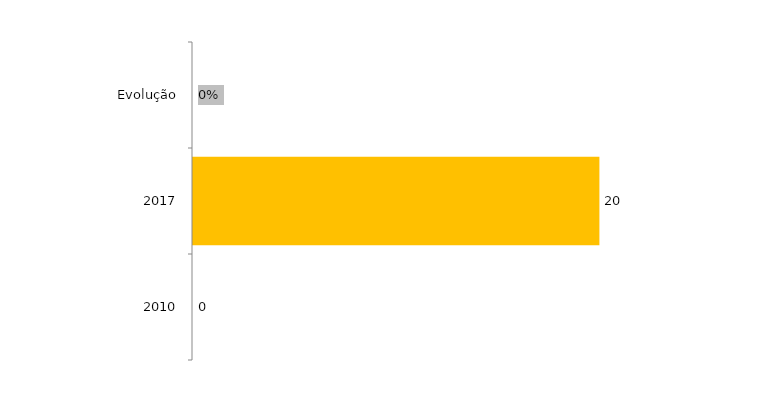
| Category | Evolução Concluintes |
|---|---|
| 2010 | 0 |
| 2017 | 20 |
| Evolução | 0 |